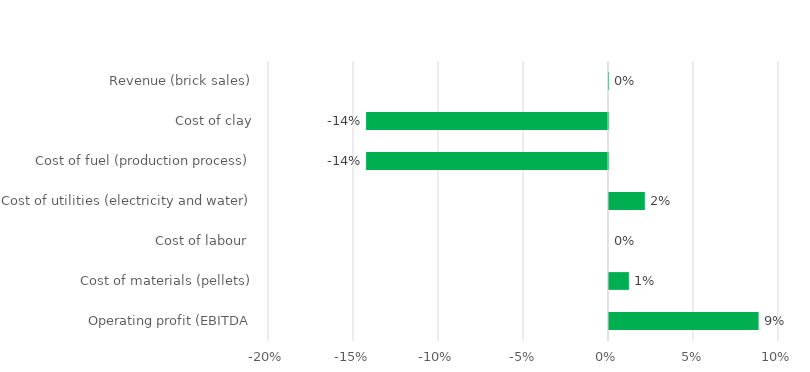
| Category | Series 0 |
|---|---|
| Operating profit (EBITDA | 0.088 |
| Cost of materials (pellets) | 0.012 |
| Cost of labour  | 0 |
| Cost of utilities (electricity and water) | 0.021 |
| Cost of fuel (production process) | -0.142 |
| Cost of clay | -0.142 |
| Revenue (brick sales) | 0 |